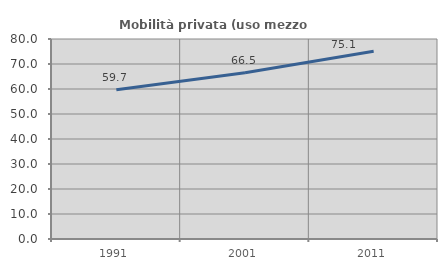
| Category | Mobilità privata (uso mezzo privato) |
|---|---|
| 1991.0 | 59.735 |
| 2001.0 | 66.529 |
| 2011.0 | 75.092 |